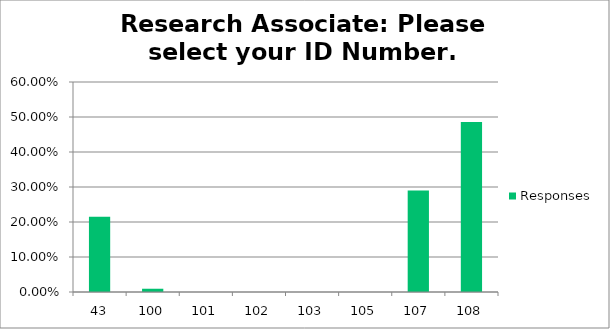
| Category | Responses |
|---|---|
| 43 | 0.215 |
| 100 | 0.009 |
| 101 | 0 |
| 102 | 0 |
| 103 | 0 |
| 105 | 0 |
| 107 | 0.29 |
| 108 | 0.486 |